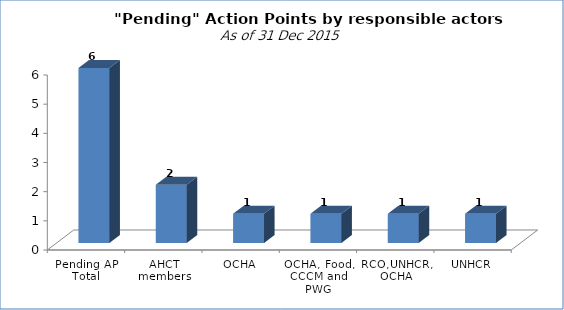
| Category | Count of Action |
|---|---|
| Pending AP Total | 6 |
| AHCT members | 2 |
| OCHA | 1 |
| OCHA, Food, CCCM and PWG | 1 |
| RCO,UNHCR, OCHA | 1 |
| UNHCR | 1 |